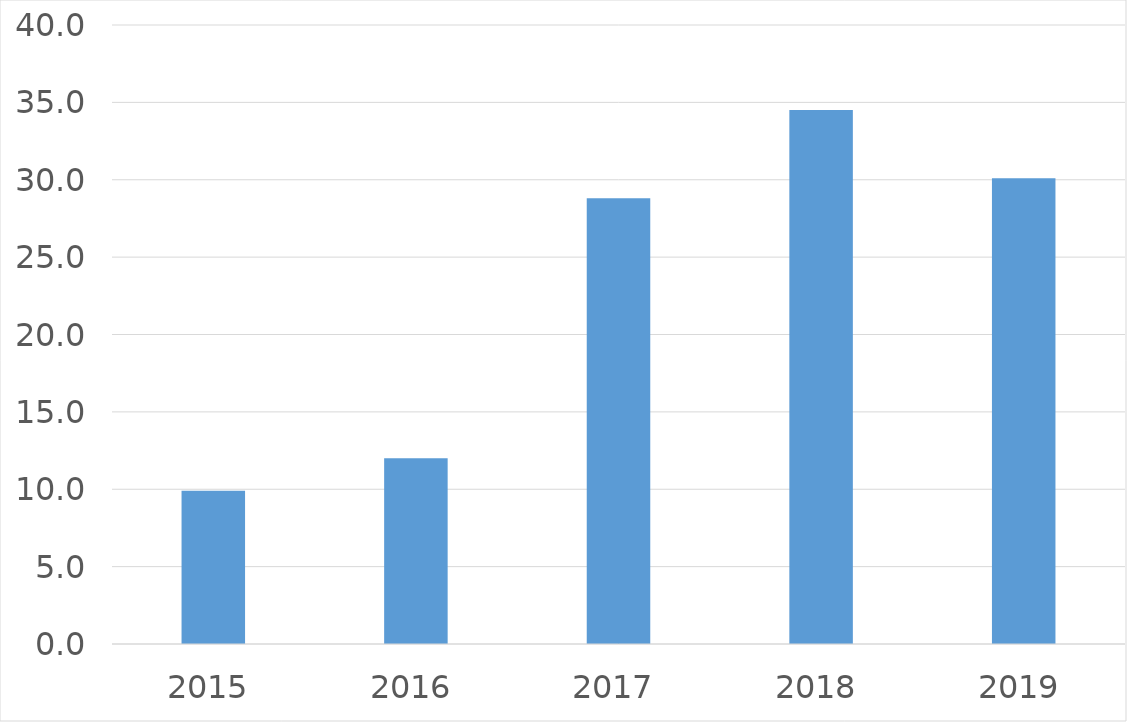
| Category | Series 0 |
|---|---|
| 2015 | 9.9 |
| 2016 | 12 |
| 2017 | 28.8 |
| 2018 | 34.5 |
| 2019 | 30.1 |